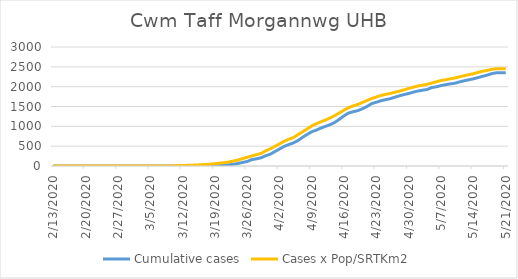
| Category | Cumulative cases | Cases x Pop/SRTKm2 |
|---|---|---|
| 5/21/20 | 2352 | 2452.855 |
| 5/20/20 | 2352 | 2452.855 |
| 5/19/20 | 2352 | 2452.278 |
| 5/18/20 | 2329 | 2438.834 |
| 5/17/20 | 2292 | 2410.216 |
| 5/16/20 | 2261 | 2388.897 |
| 5/15/20 | 2229 | 2358.935 |
| 5/14/20 | 2196 | 2325.708 |
| 5/13/20 | 2173 | 2302.66 |
| 5/12/20 | 2148 | 2276.155 |
| 5/11/20 | 2120 | 2249.843 |
| 5/10/20 | 2086 | 2217.192 |
| 5/9/20 | 2071 | 2198.177 |
| 5/8/20 | 2050 | 2174.361 |
| 5/7/20 | 2028 | 2155.155 |
| 5/6/20 | 1997 | 2123.464 |
| 5/5/20 | 1978 | 2091.774 |
| 5/4/20 | 1929 | 2061.235 |
| 5/3/20 | 1911 | 2036.651 |
| 5/2/20 | 1891 | 2018.597 |
| 5/1/20 | 1863 | 1986.522 |
| 4/30/20 | 1829 | 1956.176 |
| 4/29/20 | 1801 | 1919.3 |
| 4/28/20 | 1771 | 1887.993 |
| 4/27/20 | 1735 | 1859.952 |
| 4/26/20 | 1697 | 1828.453 |
| 4/25/20 | 1673 | 1805.598 |
| 4/24/20 | 1646 | 1779.669 |
| 4/23/20 | 1608 | 1739.912 |
| 4/22/20 | 1575 | 1701.883 |
| 4/21/20 | 1503 | 1653.675 |
| 4/20/20 | 1446 | 1605.082 |
| 4/19/20 | 1397 | 1552.265 |
| 4/18/20 | 1369 | 1518.077 |
| 4/17/20 | 1338 | 1471.405 |
| 4/16/20 | 1266 | 1409.561 |
| 4/15/20 | 1182 | 1340.61 |
| 4/14/20 | 1099 | 1272.427 |
| 4/13/20 | 1044 | 1212.887 |
| 4/12/20 | 1002 | 1161.606 |
| 4/11/20 | 957 | 1114.934 |
| 4/10/20 | 907 | 1068.07 |
| 4/9/20 | 864 | 1010.451 |
| 4/8/20 | 797 | 935.546 |
| 4/7/20 | 723 | 861.985 |
| 4/6/20 | 642 | 789.769 |
| 4/5/20 | 582 | 716.976 |
| 4/4/20 | 540 | 674.53 |
| 4/3/20 | 494 | 620.56 |
| 4/2/20 | 428 | 558.331 |
| 4/1/20 | 364 | 494.374 |
| 3/31/20 | 298 | 432.913 |
| 3/30/20 | 258 | 380.864 |
| 3/29/20 | 207 | 316.714 |
| 3/28/20 | 181 | 286.752 |
| 3/27/20 | 161 | 254.869 |
| 3/26/20 | 114 | 219.338 |
| 3/25/20 | 89 | 185.918 |
| 3/24/20 | 64 | 150.771 |
| 3/23/20 | 43 | 124.842 |
| 3/22/20 | 31 | 99.873 |
| 3/21/20 | 24 | 85.277 |
| 3/20/20 | 18 | 70.872 |
| 3/19/20 | 8 | 57.043 |
| 3/18/20 | 6 | 45.519 |
| 3/17/20 | 6 | 38.797 |
| 3/16/20 | 6 | 31.691 |
| 3/15/20 | 3 | 25.16 |
| 3/14/20 | 3 | 19.591 |
| 3/13/20 | 3 | 15.941 |
| 3/12/20 | 0 | 10.756 |
| 3/11/20 | 0 | 6.146 |
| 3/10/20 | 0 | 3.457 |
| 3/9/20 | 0 | 1.344 |
| 3/8/20 | 0 | 0.768 |
| 3/7/20 | 0 | 0.768 |
| 3/6/20 | 0 | 0.384 |
| 3/5/20 | 0 | 0.384 |
| 3/4/20 | 0 | 0.384 |
| 3/3/20 | 0 | 0.192 |
| 3/2/20 | 0 | 0.192 |
| 3/1/20 | 0 | 0.192 |
| 2/29/20 | 0 | 0.192 |
| 2/28/20 | 0 | 0.192 |
| 2/27/20 | 0 | 0.192 |
| 2/26/20 | 0 | 0 |
| 2/25/20 | 0 | 0 |
| 2/24/20 | 0 | 0 |
| 2/23/20 | 0 | 0 |
| 2/22/20 | 0 | 0 |
| 2/21/20 | 0 | 0 |
| 2/20/20 | 0 | 0 |
| 2/19/20 | 0 | 0 |
| 2/18/20 | 0 | 0 |
| 2/17/20 | 0 | 0 |
| 2/16/20 | 0 | 0 |
| 2/15/20 | 0 | 0 |
| 2/14/20 | 0 | 0 |
| 2/13/20 | 0 | 0 |